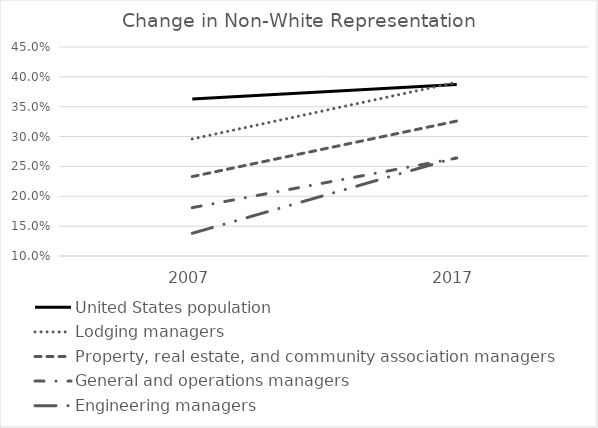
| Category | United States population | Lodging managers | Property, real estate, and community association managers | General and operations managers | Engineering managers |
|---|---|---|---|---|---|
| 2007.0 | 0.363 | 0.296 | 0.233 | 0.181 | 0.138 |
| 2017.0 | 0.387 | 0.391 | 0.326 | 0.264 | 0.265 |